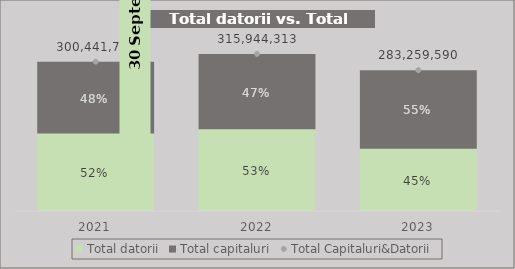
| Category | Total datorii | Total capitaluri |
|---|---|---|
| 2021.0 | 157657014.433 | 142784719.076 |
| 2022.0 | 166229248.422 | 149715064.987 |
| 2023.0 | 127470351 | 155789238.578 |